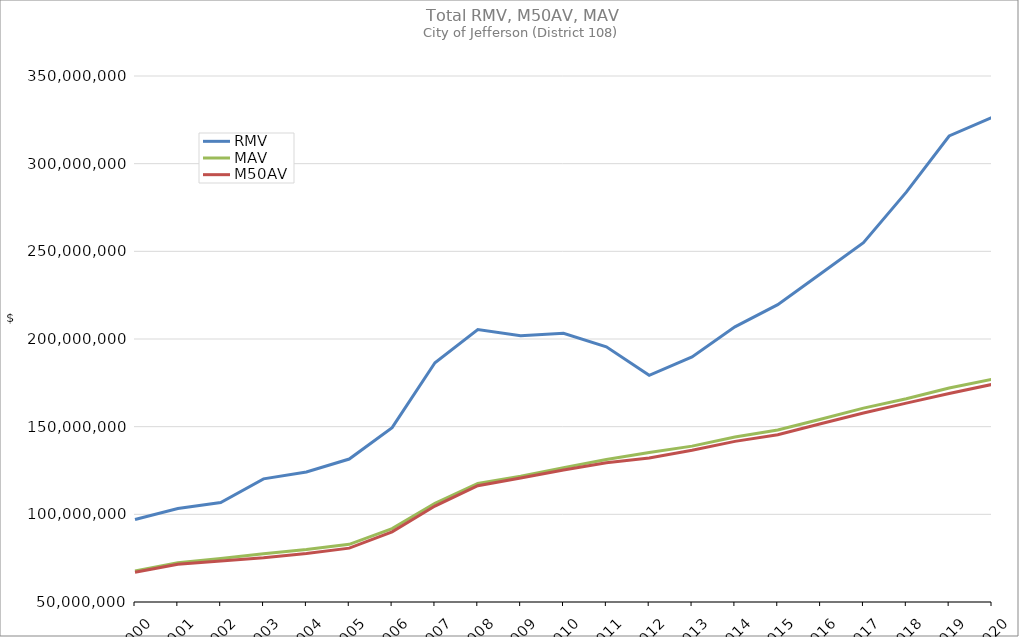
| Category | RMV | MAV | M50AV |
|---|---|---|---|
| 2000.0 | 97033881 | 67740107 | 66912969 |
| 2001.0 | 103349408 | 72435244 | 71539040 |
| 2002.0 | 106689733 | 74753829 | 73442703 |
| 2003.0 | 120229559 | 77572107 | 75209914 |
| 2004.0 | 124156740 | 79928146 | 77601308 |
| 2005.0 | 131531887 | 82908309 | 80723061 |
| 2006.0 | 149411853 | 91847724 | 90051370 |
| 2007.0 | 186473390 | 106300105 | 104714936 |
| 2008.0 | 205418303 | 117550007 | 116334350 |
| 2009.0 | 201835064 | 121792112 | 120765678 |
| 2010.0 | 203268942 | 126642659 | 125228906 |
| 2011.0 | 195569108 | 131225339 | 129443681 |
| 2012.0 | 179268881 | 135252102 | 132187851 |
| 2013.0 | 189782516 | 138900852 | 136579229 |
| 2014.0 | 206924366 | 144099155 | 141605892 |
| 2015.0 | 219569916 | 148115739 | 145382152 |
| 2016.0 | 237260431 | 154184330 | 151659404 |
| 2017.0 | 254943436 | 160557038 | 157782469 |
| 2018.0 | 283740245 | 165966750 | 163409630 |
| 2019.0 | 315790056 | 172029970 | 168901752 |
| 2020.0 | 326352639 | 177067067 | 174093002 |